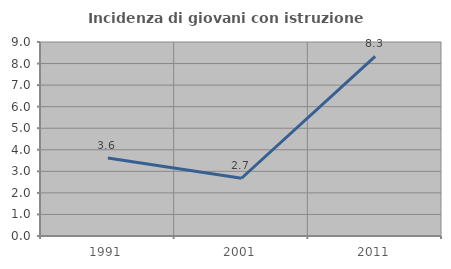
| Category | Incidenza di giovani con istruzione universitaria |
|---|---|
| 1991.0 | 3.614 |
| 2001.0 | 2.679 |
| 2011.0 | 8.333 |